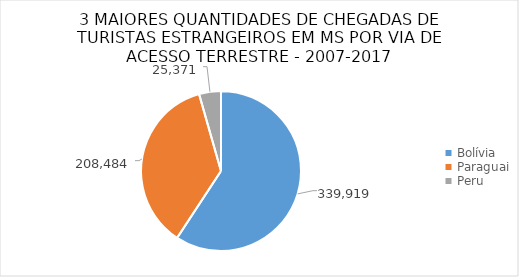
| Category | Series 0 |
|---|---|
| Bolívia | 339919 |
| Paraguai | 208484 |
| Peru | 25371 |